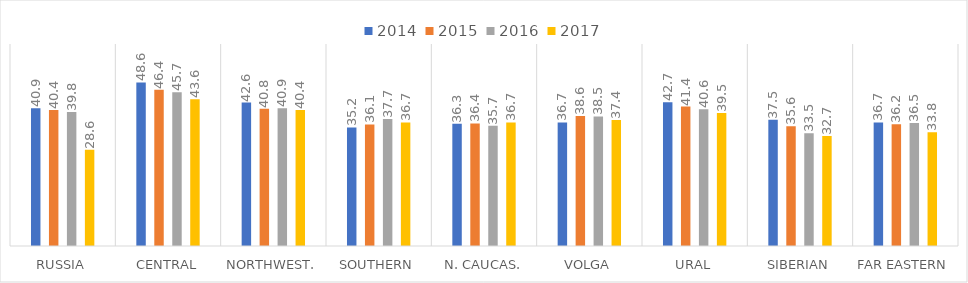
| Category | 2014 | 2015 | 2016 | 2017 |
|---|---|---|---|---|
| Russia | 40.9 | 40.4 | 39.8 | 28.6 |
| Central | 48.6 | 46.4 | 45.7 | 43.6 |
| Northwest. | 42.6 | 40.8 | 40.9 | 40.4 |
| Southern | 35.2 | 36.1 | 37.7 | 36.7 |
| N. Caucas. | 36.3 | 36.4 | 35.7 | 36.7 |
| Volga | 36.7 | 38.6 | 38.5 | 37.4 |
| Ural | 42.7 | 41.4 | 40.6 | 39.5 |
| Siberian | 37.5 | 35.6 | 33.5 | 32.7 |
| Far Eastern | 36.7 | 36.2 | 36.5 | 33.8 |